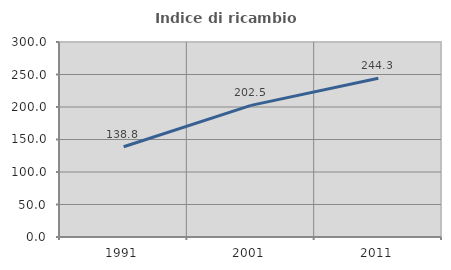
| Category | Indice di ricambio occupazionale  |
|---|---|
| 1991.0 | 138.779 |
| 2001.0 | 202.541 |
| 2011.0 | 244.326 |